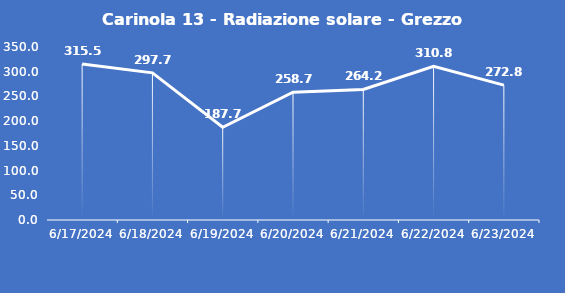
| Category | Carinola 13 - Radiazione solare - Grezzo (W/m2) |
|---|---|
| 6/17/24 | 315.5 |
| 6/18/24 | 297.7 |
| 6/19/24 | 187.7 |
| 6/20/24 | 258.7 |
| 6/21/24 | 264.2 |
| 6/22/24 | 310.8 |
| 6/23/24 | 272.8 |